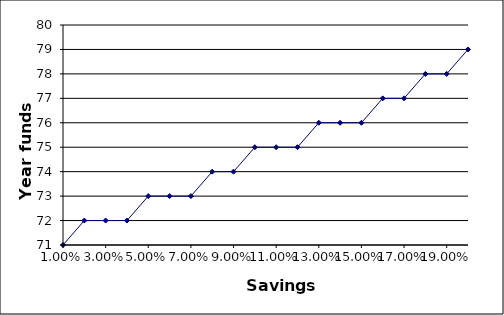
| Category | Year funds out |
|---|---|
| 0.01 | 71 |
| 0.02 | 72 |
| 0.03 | 72 |
| 0.04 | 72 |
| 0.05 | 73 |
| 0.06 | 73 |
| 0.07 | 73 |
| 0.08 | 74 |
| 0.09 | 74 |
| 0.1 | 75 |
| 0.11 | 75 |
| 0.12 | 75 |
| 0.13 | 76 |
| 0.14 | 76 |
| 0.15 | 76 |
| 0.16 | 77 |
| 0.17 | 77 |
| 0.18 | 78 |
| 0.19 | 78 |
| 0.2 | 79 |